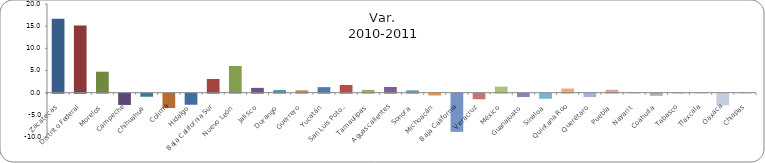
| Category | Var.
 2010-2011 |
|---|---|
| Zacatecas | 16.654 |
| Distrito Federal | 15.151 |
| Morelos | 4.727 |
| Campeche | -2.542 |
| Chihuahua | -0.692 |
| Colima | -3.247 |
| Hidalgo | -2.499 |
| Baja California Sur | 3.095 |
| Nuevo León | 6.02 |
| Jalisco | 1.081 |
| Durango | 0.574 |
| Guerrero | 0.52 |
| Yucatán | 1.245 |
| San Luis Potosí | 1.734 |
| Tamaulipas | 0.625 |
| Aguascalientes | 1.284 |
| Sonora | 0.514 |
| Michoacán | -0.413 |
| Baja California | -8.615 |
| Veracruz | -1.26 |
| México | 1.352 |
| Guanajuato | -0.753 |
| Sinaloa | -1.144 |
| Quintana Roo | 0.922 |
| Querétaro | -0.755 |
| Puebla | 0.656 |
| Nayarit | 0.116 |
| Coahuila | -0.482 |
| Tabasco | 0.102 |
| Tlaxcala | 0.133 |
| Oaxaca | -2.631 |
| Chiapas | 0.027 |